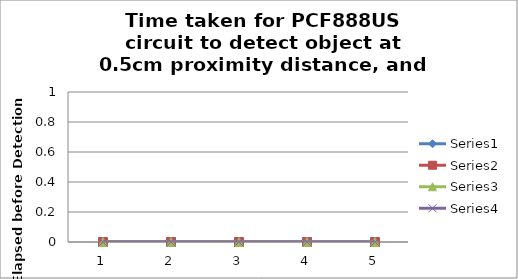
| Category | Series 0 | Series 1 | Series 2 | Series 3 |
|---|---|---|---|---|
| 0 | 0 | 0 | 0 | 0 |
| 1 | 0 | 0 | 0 | 0 |
| 2 | 0 | 0 | 0 | 0 |
| 3 | 0 | 0 | 0 | 0 |
| 4 | 0 | 0 | 0 | 0 |